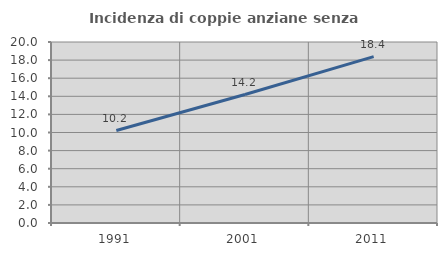
| Category | Incidenza di coppie anziane senza figli  |
|---|---|
| 1991.0 | 10.217 |
| 2001.0 | 14.194 |
| 2011.0 | 18.387 |